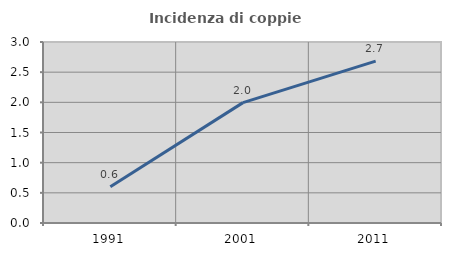
| Category | Incidenza di coppie miste |
|---|---|
| 1991.0 | 0.602 |
| 2001.0 | 1.995 |
| 2011.0 | 2.683 |